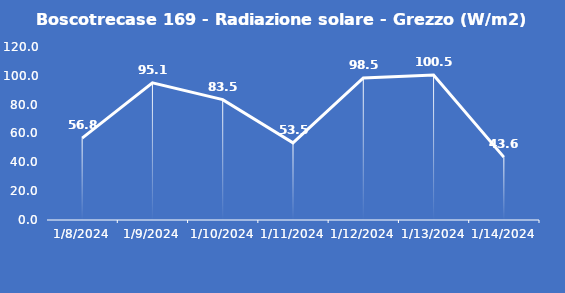
| Category | Boscotrecase 169 - Radiazione solare - Grezzo (W/m2) |
|---|---|
| 1/8/24 | 56.8 |
| 1/9/24 | 95.1 |
| 1/10/24 | 83.5 |
| 1/11/24 | 53.5 |
| 1/12/24 | 98.5 |
| 1/13/24 | 100.5 |
| 1/14/24 | 43.6 |